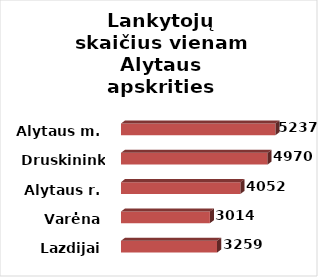
| Category | Series 0 |
|---|---|
| Lazdijai | 3259 |
| Varėna | 3014 |
| Alytaus r. | 4052 |
| Druskininkai | 4970 |
| Alytaus m. | 5237 |